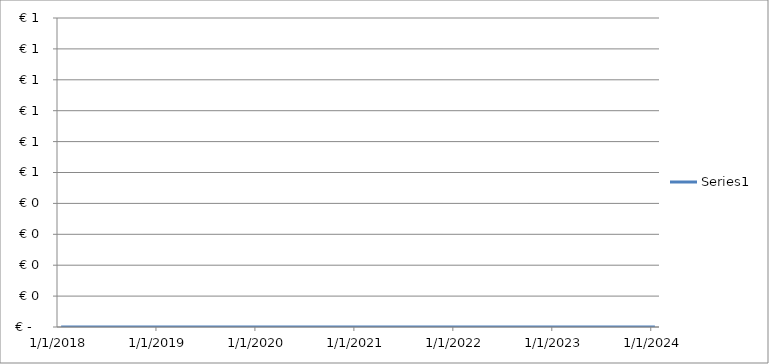
| Category | Series 0 |
|---|---|
| 1/1/18 | 0 |
| 1/1/19 | 0 |
| 1/1/20 | 0 |
| 1/1/21 | 0 |
| 1/1/22 | 0 |
| 1/1/23 | 0 |
| 1/1/24 | 0 |